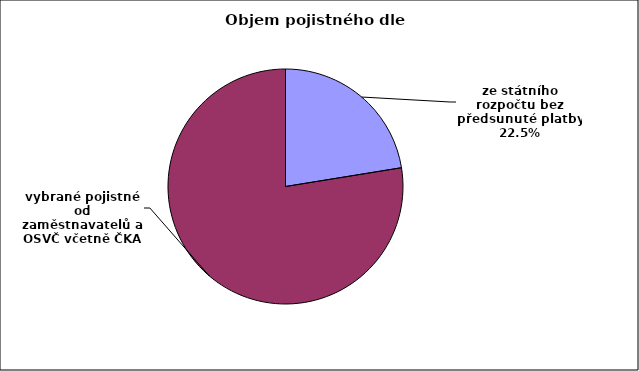
| Category | Series 0 |
|---|---|
| ze státního rozpočtu bez předsunuté platby | 0.224 |
| vybrané pojistné od zaměstnavatelů a OSVČ včetně ČKA | 0.776 |